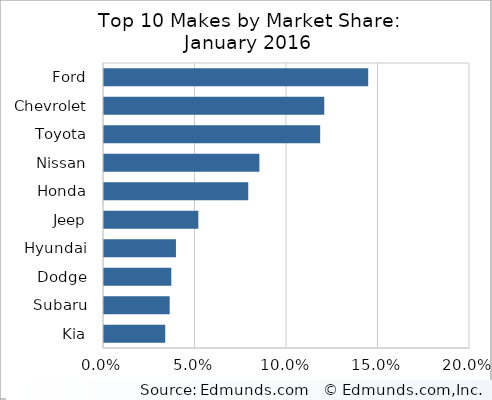
| Category | Series 0 |
|---|---|
| Ford | 0.144 |
| Chevrolet | 0.12 |
| Toyota | 0.118 |
| Nissan | 0.085 |
| Honda | 0.079 |
| Jeep | 0.052 |
| Hyundai | 0.039 |
| Dodge | 0.037 |
| Subaru | 0.036 |
| Kia | 0.033 |